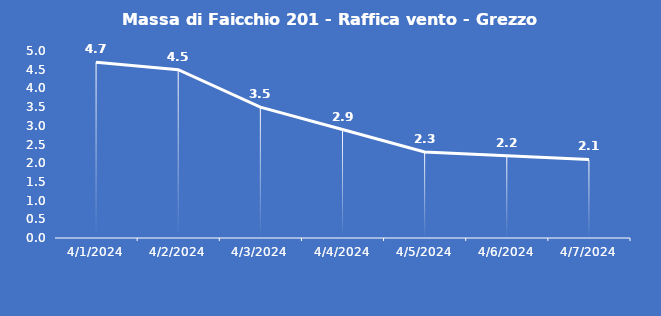
| Category | Massa di Faicchio 201 - Raffica vento - Grezzo (m/s) |
|---|---|
| 4/1/24 | 4.7 |
| 4/2/24 | 4.5 |
| 4/3/24 | 3.5 |
| 4/4/24 | 2.9 |
| 4/5/24 | 2.3 |
| 4/6/24 | 2.2 |
| 4/7/24 | 2.1 |